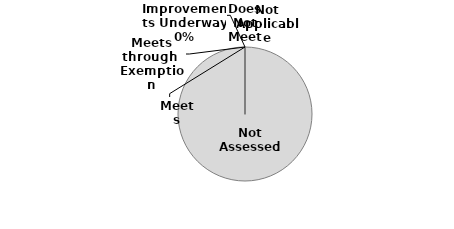
| Category | Series 0 |
|---|---|
| Not Assessed | 4 |
| Not Applicable | 0 |
| Meets | 0 |
| Meets through  Exemption | 0 |
| Improvements Underway | 0 |
| Does Not Meet | 0 |